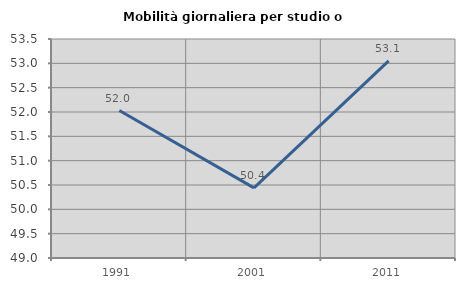
| Category | Mobilità giornaliera per studio o lavoro |
|---|---|
| 1991.0 | 52.03 |
| 2001.0 | 50.441 |
| 2011.0 | 53.052 |